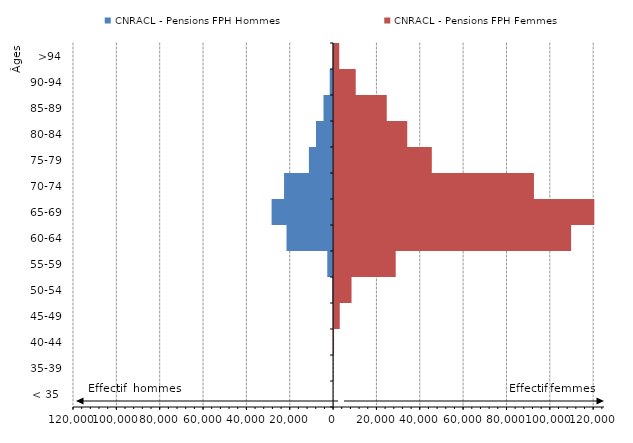
| Category | CNRACL - Pensions FPH Hommes | CNRACL - Pensions FPH Femmes |
|---|---|---|
| < 35  | -6 | 28 |
| 35-39 | -22 | 156 |
| 40-44 | -74 | 453 |
| 45-49 | -203 | 3083 |
| 50-54 | -442 | 8517 |
| 55-59 | -2675 | 28897 |
| 60-64 | -21484 | 109832 |
| 65-69 | -28364 | 120539 |
| 70-74 | -22621 | 92674 |
| 75-79 | -11153 | 45549 |
| 80-84 | -7880 | 34219 |
| 85-89 | -4415 | 24762 |
| 90-94 | -1549 | 10452 |
| >94 | -287 | 2836 |